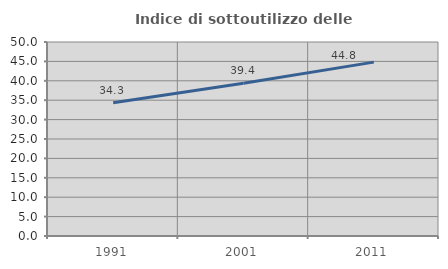
| Category | Indice di sottoutilizzo delle abitazioni  |
|---|---|
| 1991.0 | 34.319 |
| 2001.0 | 39.358 |
| 2011.0 | 44.816 |